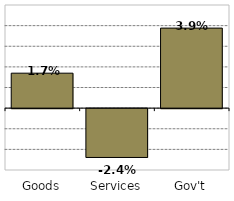
| Category | Series 0 |
|---|---|
| Goods | 0.017 |
| Services | -0.024 |
| Gov't | 0.039 |